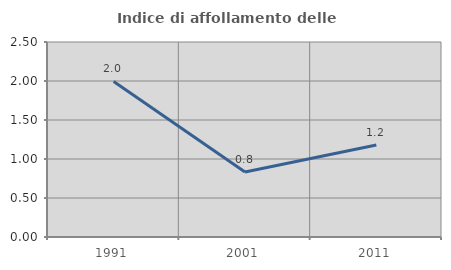
| Category | Indice di affollamento delle abitazioni  |
|---|---|
| 1991.0 | 1.995 |
| 2001.0 | 0.834 |
| 2011.0 | 1.181 |